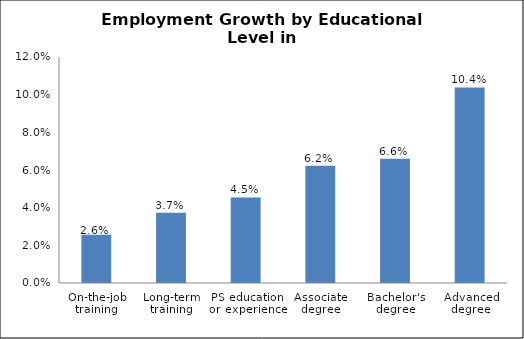
| Category | Series 0 |
|---|---|
| On-the-job training | 0.026 |
| Long-term training | 0.037 |
| PS education or experience | 0.045 |
| Associate degree | 0.062 |
| Bachelor's degree | 0.066 |
| Advanced degree | 0.104 |